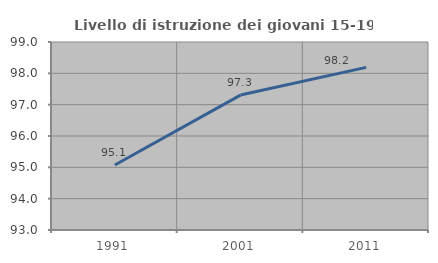
| Category | Livello di istruzione dei giovani 15-19 anni |
|---|---|
| 1991.0 | 95.074 |
| 2001.0 | 97.306 |
| 2011.0 | 98.189 |